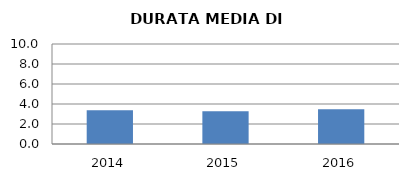
| Category | 2014 2015 2016 |
|---|---|
| 2014.0 | 3.375 |
| 2015.0 | 3.273 |
| 2016.0 | 3.476 |